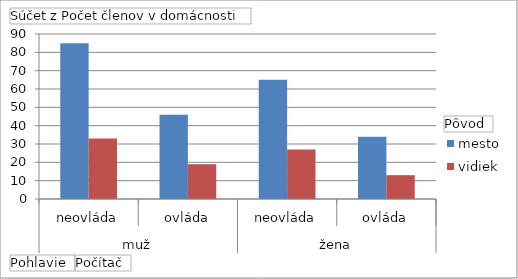
| Category | mesto | vidiek |
|---|---|---|
| 0 | 85 | 33 |
| 1 | 46 | 19 |
| 2 | 65 | 27 |
| 3 | 34 | 13 |